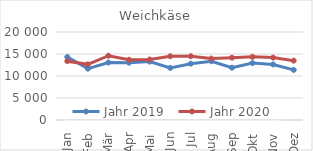
| Category | Jahr 2019 | Jahr 2020 |
|---|---|---|
| Jan | 14316.514 | 13374.481 |
| Feb | 11666.821 | 12652.374 |
| Mär | 13067.466 | 14610.598 |
| Apr | 13020.785 | 13682.594 |
| Mai | 13273.747 | 13753.955 |
| Jun | 11832.941 | 14490.197 |
| Jul | 12793.557 | 14493.823 |
| Aug | 13361.077 | 13959.088 |
| Sep | 11884.228 | 14170.974 |
| Okt | 12938.939 | 14346.689 |
| Nov | 12624.278 | 14180.385 |
| Dez | 11390.115 | 13486.22 |